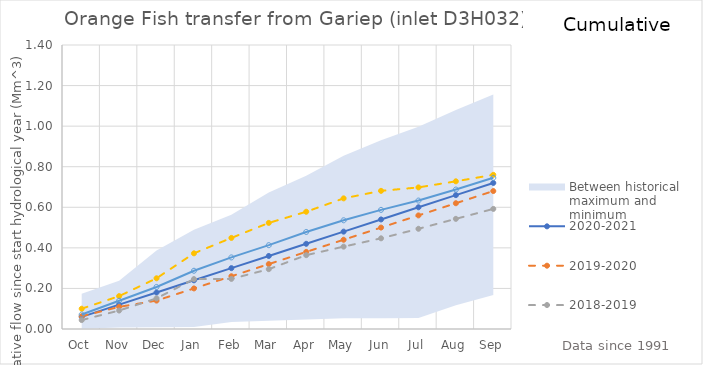
| Category | 2020-2021 | 2019-2020 | 2018-2019 | 2017-2018 | Mean total series |
|---|---|---|---|---|---|
| Oct | 0.06 | 0.063 | 0.044 | 0.1 | 0.071 |
| Nov | 0.12 | 0.109 | 0.091 | 0.162 | 0.139 |
| Dec | 0.18 | 0.14 | 0.151 | 0.25 | 0.207 |
| Jan | 0.24 | 0.2 | 0.246 | 0.373 | 0.287 |
| Feb | 0.3 | 0.26 | 0.247 | 0.449 | 0.353 |
| Mar | 0.36 | 0.32 | 0.295 | 0.523 | 0.413 |
| Apr | 0.42 | 0.38 | 0.364 | 0.578 | 0.478 |
| May | 0.48 | 0.44 | 0.406 | 0.644 | 0.536 |
| Jun | 0.54 | 0.5 | 0.447 | 0.681 | 0.587 |
| Jul | 0.6 | 0.56 | 0.494 | 0.698 | 0.633 |
| Aug | 0.66 | 0.62 | 0.543 | 0.728 | 0.687 |
| Sep | 0.72 | 0.68 | 0.592 | 0.76 | 0.745 |